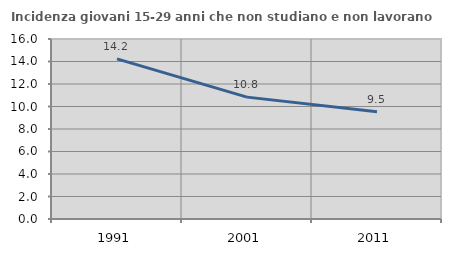
| Category | Incidenza giovani 15-29 anni che non studiano e non lavorano  |
|---|---|
| 1991.0 | 14.229 |
| 2001.0 | 10.833 |
| 2011.0 | 9.524 |